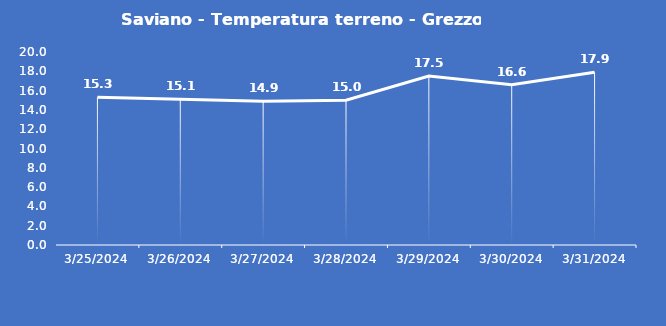
| Category | Saviano - Temperatura terreno - Grezzo (°C) |
|---|---|
| 3/25/24 | 15.3 |
| 3/26/24 | 15.1 |
| 3/27/24 | 14.9 |
| 3/28/24 | 15 |
| 3/29/24 | 17.5 |
| 3/30/24 | 16.6 |
| 3/31/24 | 17.9 |